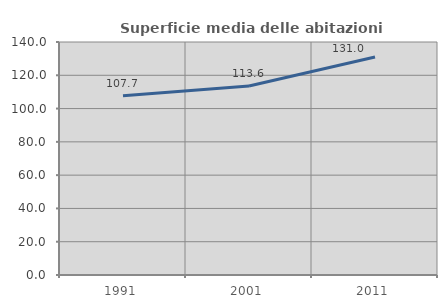
| Category | Superficie media delle abitazioni occupate |
|---|---|
| 1991.0 | 107.711 |
| 2001.0 | 113.581 |
| 2011.0 | 131.035 |